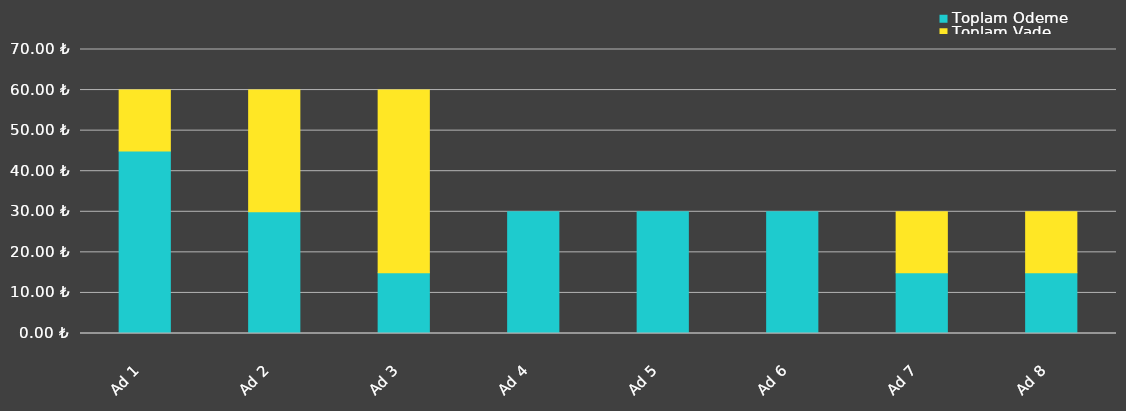
| Category | Toplam Ödeme | Toplam Vade |
|---|---|---|
| Ad 1 | 45 | 15 |
| Ad 2 | 30 | 30 |
| Ad 3 | 15 | 45 |
| Ad 4 | 30 | 0 |
| Ad 5 | 30 | 0 |
| Ad 6 | 30 | 0 |
| Ad 7 | 15 | 15 |
| Ad 8 | 15 | 15 |